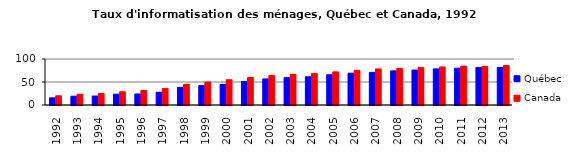
| Category | Québec | Canada |
|---|---|---|
| 1992 | 15.5 | 20 |
| 1993 | 19.1 | 23.3 |
| 1994 | 19.5 | 25 |
| 1995 | 23.5 | 28.8 |
| 1996 | 24 | 31.6 |
| 1997 | 27.7 | 36 |
| 1998 | 38.4 | 45 |
| 1999 | 42.2 | 49.8 |
| 2000 | 44.8 | 54.9 |
| 2001 | 51.1 | 59.9 |
| 2002 | 56.7 | 63.9 |
| 2003 | 59.5 | 66.8 |
| 2004 | 61.4 | 68.7 |
| 2005 | 65.7 | 72 |
| 2006 | 69.2 | 75.4 |
| 2007 | 70.9 | 78.4 |
| 2008 | 74.2 | 79.4 |
| 2009 | 76 | 81.7 |
| 2010 | 78.5 | 82.7 |
| 2011 | 80 | 84.5 |
| 2012 | 81.7 | 84.1 |
| 2013 | 81.8 | 85.6 |